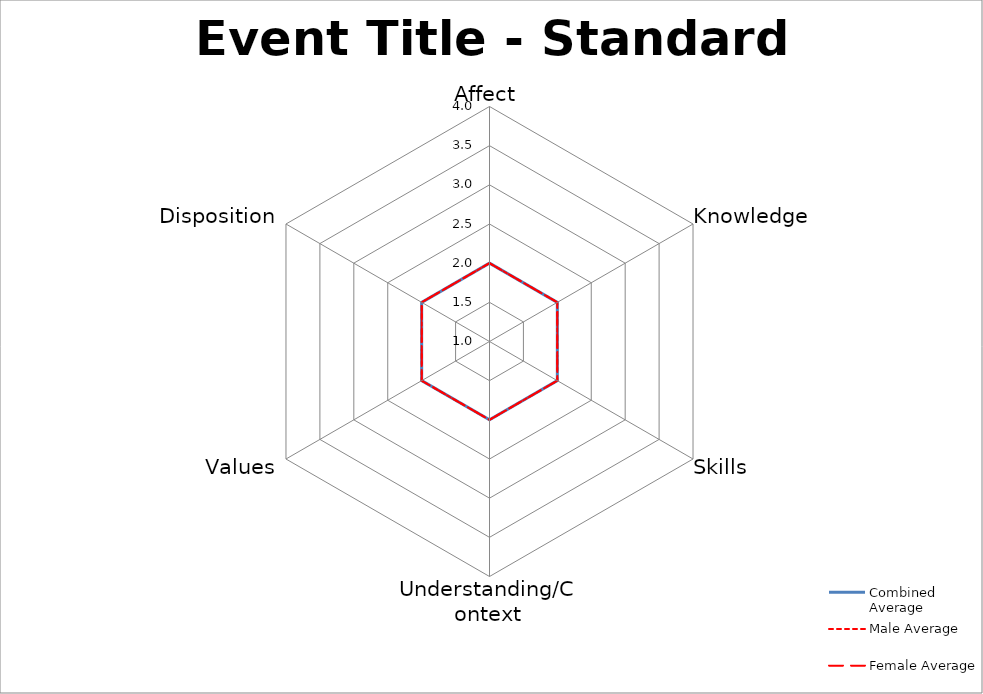
| Category | Combined Average | Male Average | Female Average |
|---|---|---|---|
| Affect | 0 | 0 | 0 |
| Knowledge | 0 | 0 | 0 |
| Skills | 0 | 0 | 0 |
| Understanding/Context | 0 | 0 | 0 |
| Values | 0 | 0 | 0 |
| Disposition | 0 | 0 | 0 |